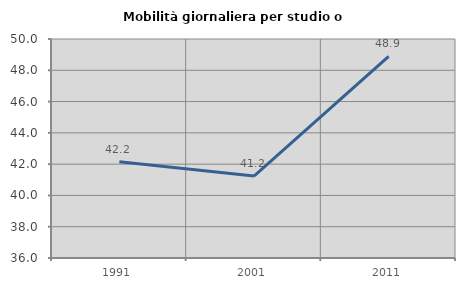
| Category | Mobilità giornaliera per studio o lavoro |
|---|---|
| 1991.0 | 42.152 |
| 2001.0 | 41.236 |
| 2011.0 | 48.889 |